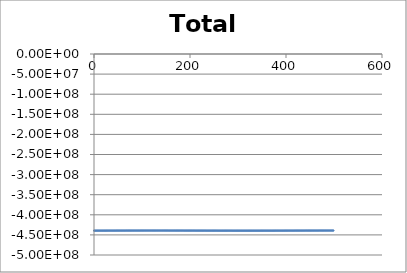
| Category | Total Energy |
|---|---|
| 0.0 | -439333333.333 |
| 1.0 | -439331749.302 |
| 2.0 | -439330144.525 |
| 3.0 | -439328519.493 |
| 4.0 | -439326874.708 |
| 5.0 | -439325210.683 |
| 6.0 | -439323527.935 |
| 7.0 | -439321826.993 |
| 8.0 | -439320108.393 |
| 9.0 | -439318372.68 |
| 10.0 | -439316620.407 |
| 11.0 | -439314852.133 |
| 12.0 | -439313068.427 |
| 13.0 | -439311269.863 |
| 14.0 | -439309457.022 |
| 15.0 | -439307630.495 |
| 16.0 | -439305790.875 |
| 17.0 | -439303938.764 |
| 18.0 | -439302074.769 |
| 19.0 | -439300199.503 |
| 20.0 | -439298313.585 |
| 21.0 | -439296417.637 |
| 22.0 | -439294512.289 |
| 23.0 | -439292598.172 |
| 24.0 | -439290675.924 |
| 25.0 | -439288746.186 |
| 26.0 | -439286809.603 |
| 27.0 | -439284866.822 |
| 28.0 | -439282918.494 |
| 29.0 | -439280965.274 |
| 30.0 | -439279007.816 |
| 31.0 | -439277046.781 |
| 32.0 | -439275082.827 |
| 33.0 | -439273116.616 |
| 34.0 | -439271148.81 |
| 35.0 | -439269180.074 |
| 36.0 | -439267211.07 |
| 37.0 | -439265242.464 |
| 38.0 | -439263274.918 |
| 39.0 | -439261309.097 |
| 40.0 | -439259345.662 |
| 41.0 | -439257385.277 |
| 42.0 | -439255428.6 |
| 43.0 | -439253476.29 |
| 44.0 | -439251529.003 |
| 45.0 | -439249587.394 |
| 46.0 | -439247652.113 |
| 47.0 | -439245723.808 |
| 48.0 | -439243803.125 |
| 49.0 | -439241890.705 |
| 50.0 | -439239987.184 |
| 51.0 | -439238093.197 |
| 52.0 | -439236209.371 |
| 53.0 | -439234336.33 |
| 54.0 | -439232474.693 |
| 55.0 | -439230625.073 |
| 56.0 | -439228788.077 |
| 57.0 | -439226964.307 |
| 58.0 | -439225154.359 |
| 59.0 | -439223358.822 |
| 60.0 | -439221578.277 |
| 61.0 | -439219813.299 |
| 62.0 | -439218064.458 |
| 63.0 | -439216332.312 |
| 64.0 | -439214617.416 |
| 65.0 | -439212920.313 |
| 66.0 | -439211241.541 |
| 67.0 | -439209581.627 |
| 68.0 | -439207941.092 |
| 69.0 | -439206320.447 |
| 70.0 | -439204720.193 |
| 71.0 | -439203140.823 |
| 72.0 | -439201582.821 |
| 73.0 | -439200046.66 |
| 74.0 | -439198532.806 |
| 75.0 | -439197041.712 |
| 76.0 | -439195573.823 |
| 77.0 | -439194129.573 |
| 78.0 | -439192709.386 |
| 79.0 | -439191313.677 |
| 80.0 | -439189942.847 |
| 81.0 | -439188597.291 |
| 82.0 | -439187277.388 |
| 83.0 | -439185983.511 |
| 84.0 | -439184716.02 |
| 85.0 | -439183475.263 |
| 86.0 | -439182261.579 |
| 87.0 | -439181075.294 |
| 88.0 | -439179916.724 |
| 89.0 | -439178786.174 |
| 90.0 | -439177683.937 |
| 91.0 | -439176610.294 |
| 92.0 | -439175565.516 |
| 93.0 | -439174549.862 |
| 94.0 | -439173563.579 |
| 95.0 | -439172606.904 |
| 96.0 | -439171680.062 |
| 97.0 | -439170783.266 |
| 98.0 | -439169916.718 |
| 99.0 | -439169080.609 |
| 100.0 | -439168275.118 |
| 101.0 | -439167500.413 |
| 102.0 | -439166756.65 |
| 103.0 | -439166043.976 |
| 104.0 | -439165362.524 |
| 105.0 | -439164712.417 |
| 106.0 | -439164093.768 |
| 107.0 | -439163506.677 |
| 108.0 | -439162951.234 |
| 109.0 | -439162427.519 |
| 110.0 | -439161935.599 |
| 111.0 | -439161475.533 |
| 112.0 | -439161047.368 |
| 113.0 | -439160651.139 |
| 114.0 | -439160286.873 |
| 115.0 | -439159954.585 |
| 116.0 | -439159654.281 |
| 117.0 | -439159385.957 |
| 118.0 | -439159149.596 |
| 119.0 | -439158945.176 |
| 120.0 | -439158772.66 |
| 121.0 | -439158632.006 |
| 122.0 | -439158523.159 |
| 123.0 | -439158446.057 |
| 124.0 | -439158400.626 |
| 125.0 | -439158386.786 |
| 126.0 | -439158404.446 |
| 127.0 | -439158453.506 |
| 128.0 | -439158533.859 |
| 129.0 | -439158645.387 |
| 130.0 | -439158787.964 |
| 131.0 | -439158961.459 |
| 132.0 | -439159165.727 |
| 133.0 | -439159400.621 |
| 134.0 | -439159665.981 |
| 135.0 | -439159961.642 |
| 136.0 | -439160287.432 |
| 137.0 | -439160643.168 |
| 138.0 | -439161028.664 |
| 139.0 | -439161443.723 |
| 140.0 | -439161888.145 |
| 141.0 | -439162361.719 |
| 142.0 | -439162864.229 |
| 143.0 | -439163395.454 |
| 144.0 | -439163955.164 |
| 145.0 | -439164543.124 |
| 146.0 | -439165159.092 |
| 147.0 | -439165802.821 |
| 148.0 | -439166474.057 |
| 149.0 | -439167172.542 |
| 150.0 | -439167898.011 |
| 151.0 | -439168650.193 |
| 152.0 | -439169428.813 |
| 153.0 | -439170233.59 |
| 154.0 | -439171064.239 |
| 155.0 | -439171920.468 |
| 156.0 | -439172801.983 |
| 157.0 | -439173708.482 |
| 158.0 | -439174639.662 |
| 159.0 | -439175595.213 |
| 160.0 | -439176574.822 |
| 161.0 | -439177578.172 |
| 162.0 | -439178604.94 |
| 163.0 | -439179654.801 |
| 164.0 | -439180727.427 |
| 165.0 | -439181822.483 |
| 166.0 | -439182939.635 |
| 167.0 | -439184078.54 |
| 168.0 | -439185238.857 |
| 169.0 | -439186420.239 |
| 170.0 | -439187622.335 |
| 171.0 | -439188844.794 |
| 172.0 | -439190087.26 |
| 173.0 | -439191349.374 |
| 174.0 | -439192630.775 |
| 175.0 | -439193931.1 |
| 176.0 | -439195249.982 |
| 177.0 | -439196587.052 |
| 178.0 | -439197941.939 |
| 179.0 | -439199314.27 |
| 180.0 | -439200703.67 |
| 181.0 | -439202109.76 |
| 182.0 | -439203532.162 |
| 183.0 | -439204970.493 |
| 184.0 | -439206424.37 |
| 185.0 | -439207893.408 |
| 186.0 | -439209377.221 |
| 187.0 | -439210875.419 |
| 188.0 | -439212387.612 |
| 189.0 | -439213913.409 |
| 190.0 | -439215452.418 |
| 191.0 | -439217004.242 |
| 192.0 | -439218568.488 |
| 193.0 | -439220144.758 |
| 194.0 | -439221732.654 |
| 195.0 | -439223331.776 |
| 196.0 | -439224941.725 |
| 197.0 | -439226562.099 |
| 198.0 | -439228192.495 |
| 199.0 | -439229832.512 |
| 200.0 | -439231481.744 |
| 201.0 | -439233139.788 |
| 202.0 | -439234806.237 |
| 203.0 | -439236480.685 |
| 204.0 | -439238162.725 |
| 205.0 | -439239851.949 |
| 206.0 | -439241547.95 |
| 207.0 | -439243250.319 |
| 208.0 | -439244958.646 |
| 209.0 | -439246672.522 |
| 210.0 | -439248391.537 |
| 211.0 | -439250115.28 |
| 212.0 | -439251843.341 |
| 213.0 | -439253575.308 |
| 214.0 | -439255310.769 |
| 215.0 | -439257049.314 |
| 216.0 | -439258790.53 |
| 217.0 | -439260534.006 |
| 218.0 | -439262279.329 |
| 219.0 | -439264026.086 |
| 220.0 | -439265773.866 |
| 221.0 | -439267522.256 |
| 222.0 | -439269270.844 |
| 223.0 | -439271019.217 |
| 224.0 | -439272766.963 |
| 225.0 | -439274513.67 |
| 226.0 | -439276258.925 |
| 227.0 | -439278002.317 |
| 228.0 | -439279743.433 |
| 229.0 | -439281481.863 |
| 230.0 | -439283217.195 |
| 231.0 | -439284949.018 |
| 232.0 | -439286676.921 |
| 233.0 | -439288400.493 |
| 234.0 | -439290119.326 |
| 235.0 | -439291833.009 |
| 236.0 | -439293541.133 |
| 237.0 | -439295243.289 |
| 238.0 | -439296939.07 |
| 239.0 | -439298628.068 |
| 240.0 | -439300309.876 |
| 241.0 | -439301984.087 |
| 242.0 | -439303650.298 |
| 243.0 | -439305308.101 |
| 244.0 | -439306957.094 |
| 245.0 | -439308596.873 |
| 246.0 | -439310227.036 |
| 247.0 | -439311847.181 |
| 248.0 | -439313456.909 |
| 249.0 | -439315055.818 |
| 250.0 | -439316643.512 |
| 251.0 | -439318219.593 |
| 252.0 | -439319783.664 |
| 253.0 | -439321335.331 |
| 254.0 | -439322874.201 |
| 255.0 | -439324399.88 |
| 256.0 | -439325911.978 |
| 257.0 | -439327410.106 |
| 258.0 | -439328893.875 |
| 259.0 | -439330362.9 |
| 260.0 | -439331816.796 |
| 261.0 | -439333255.18 |
| 262.0 | -439334677.671 |
| 263.0 | -439336083.89 |
| 264.0 | -439337473.459 |
| 265.0 | -439338846.003 |
| 266.0 | -439340201.149 |
| 267.0 | -439341538.526 |
| 268.0 | -439342857.765 |
| 269.0 | -439344158.501 |
| 270.0 | -439345440.369 |
| 271.0 | -439346703.007 |
| 272.0 | -439347946.058 |
| 273.0 | -439349169.164 |
| 274.0 | -439350371.974 |
| 275.0 | -439351554.136 |
| 276.0 | -439352715.303 |
| 277.0 | -439353855.13 |
| 278.0 | -439354973.278 |
| 279.0 | -439356069.409 |
| 280.0 | -439357143.187 |
| 281.0 | -439358194.282 |
| 282.0 | -439359222.368 |
| 283.0 | -439360227.12 |
| 284.0 | -439361208.22 |
| 285.0 | -439362165.351 |
| 286.0 | -439363098.203 |
| 287.0 | -439364006.469 |
| 288.0 | -439364889.844 |
| 289.0 | -439365748.032 |
| 290.0 | -439366580.739 |
| 291.0 | -439367387.675 |
| 292.0 | -439368168.556 |
| 293.0 | -439368923.103 |
| 294.0 | -439369651.043 |
| 295.0 | -439370352.105 |
| 296.0 | -439371026.028 |
| 297.0 | -439371672.552 |
| 298.0 | -439372291.426 |
| 299.0 | -439372882.403 |
| 300.0 | -439373445.244 |
| 301.0 | -439373979.712 |
| 302.0 | -439374485.581 |
| 303.0 | -439374962.628 |
| 304.0 | -439375410.638 |
| 305.0 | -439375829.402 |
| 306.0 | -439376218.719 |
| 307.0 | -439376578.393 |
| 308.0 | -439376908.236 |
| 309.0 | -439377208.068 |
| 310.0 | -439377477.716 |
| 311.0 | -439377717.013 |
| 312.0 | -439377925.802 |
| 313.0 | -439378103.931 |
| 314.0 | -439378251.26 |
| 315.0 | -439378367.652 |
| 316.0 | -439378452.983 |
| 317.0 | -439378507.134 |
| 318.0 | -439378529.995 |
| 319.0 | -439378521.467 |
| 320.0 | -439378481.458 |
| 321.0 | -439378409.883 |
| 322.0 | -439378306.67 |
| 323.0 | -439378171.754 |
| 324.0 | -439378005.078 |
| 325.0 | -439377806.597 |
| 326.0 | -439377576.274 |
| 327.0 | -439377314.083 |
| 328.0 | -439377020.005 |
| 329.0 | -439376694.035 |
| 330.0 | -439376336.174 |
| 331.0 | -439375946.435 |
| 332.0 | -439375524.842 |
| 333.0 | -439375071.428 |
| 334.0 | -439374586.237 |
| 335.0 | -439374069.322 |
| 336.0 | -439373520.75 |
| 337.0 | -439372940.595 |
| 338.0 | -439372328.944 |
| 339.0 | -439371685.894 |
| 340.0 | -439371011.553 |
| 341.0 | -439370306.041 |
| 342.0 | -439369569.487 |
| 343.0 | -439368802.033 |
| 344.0 | -439368003.831 |
| 345.0 | -439367175.045 |
| 346.0 | -439366315.85 |
| 347.0 | -439365426.431 |
| 348.0 | -439364506.986 |
| 349.0 | -439363557.724 |
| 350.0 | -439362578.865 |
| 351.0 | -439361570.64 |
| 352.0 | -439360533.292 |
| 353.0 | -439359467.076 |
| 354.0 | -439358372.255 |
| 355.0 | -439357249.108 |
| 356.0 | -439356097.922 |
| 357.0 | -439354918.996 |
| 358.0 | -439353712.641 |
| 359.0 | -439352479.179 |
| 360.0 | -439351218.941 |
| 361.0 | -439349932.273 |
| 362.0 | -439348619.528 |
| 363.0 | -439347281.073 |
| 364.0 | -439345917.283 |
| 365.0 | -439344528.547 |
| 366.0 | -439343115.261 |
| 367.0 | -439341677.835 |
| 368.0 | -439340216.687 |
| 369.0 | -439338732.247 |
| 370.0 | -439337224.952 |
| 371.0 | -439335695.254 |
| 372.0 | -439334143.61 |
| 373.0 | -439332570.49 |
| 374.0 | -439330976.373 |
| 375.0 | -439329361.746 |
| 376.0 | -439327727.105 |
| 377.0 | -439326072.958 |
| 378.0 | -439324399.82 |
| 379.0 | -439322708.213 |
| 380.0 | -439320998.671 |
| 381.0 | -439319271.733 |
| 382.0 | -439317527.948 |
| 383.0 | -439315767.873 |
| 384.0 | -439313992.07 |
| 385.0 | -439312201.112 |
| 386.0 | -439310395.576 |
| 387.0 | -439308576.047 |
| 388.0 | -439306743.118 |
| 389.0 | -439304897.386 |
| 390.0 | -439303039.457 |
| 391.0 | -439301169.938 |
| 392.0 | -439299289.447 |
| 393.0 | -439297398.604 |
| 394.0 | -439295498.035 |
| 395.0 | -439293588.37 |
| 396.0 | -439291670.244 |
| 397.0 | -439289744.297 |
| 398.0 | -439287811.17 |
| 399.0 | -439285871.511 |
| 400.0 | -439283925.968 |
| 401.0 | -439281975.194 |
| 402.0 | -439280019.844 |
| 403.0 | -439278060.575 |
| 404.0 | -439276098.047 |
| 405.0 | -439274132.92 |
| 406.0 | -439272165.855 |
| 407.0 | -439270197.517 |
| 408.0 | -439268228.569 |
| 409.0 | -439266259.674 |
| 410.0 | -439264291.497 |
| 411.0 | -439262324.702 |
| 412.0 | -439260359.952 |
| 413.0 | -439258397.908 |
| 414.0 | -439256439.232 |
| 415.0 | -439254484.584 |
| 416.0 | -439252534.619 |
| 417.0 | -439250589.995 |
| 418.0 | -439248651.362 |
| 419.0 | -439246719.372 |
| 420.0 | -439244794.67 |
| 421.0 | -439242877.9 |
| 422.0 | -439240969.701 |
| 423.0 | -439239070.708 |
| 424.0 | -439237181.553 |
| 425.0 | -439235302.861 |
| 426.0 | -439233435.254 |
| 427.0 | -439231579.348 |
| 428.0 | -439229735.753 |
| 429.0 | -439227905.074 |
| 430.0 | -439226087.909 |
| 431.0 | -439224284.852 |
| 432.0 | -439222496.487 |
| 433.0 | -439220723.393 |
| 434.0 | -439218966.143 |
| 435.0 | -439217225.3 |
| 436.0 | -439215501.421 |
| 437.0 | -439213795.056 |
| 438.0 | -439212106.745 |
| 439.0 | -439210437.02 |
| 440.0 | -439208786.407 |
| 441.0 | -439207155.42 |
| 442.0 | -439205544.566 |
| 443.0 | -439203954.343 |
| 444.0 | -439202385.239 |
| 445.0 | -439200837.733 |
| 446.0 | -439199312.295 |
| 447.0 | -439197809.383 |
| 448.0 | -439196329.448 |
| 449.0 | -439194872.928 |
| 450.0 | -439193440.255 |
| 451.0 | -439192031.845 |
| 452.0 | -439190648.109 |
| 453.0 | -439189289.444 |
| 454.0 | -439187956.237 |
| 455.0 | -439186648.866 |
| 456.0 | -439185367.695 |
| 457.0 | -439184113.08 |
| 458.0 | -439182885.364 |
| 459.0 | -439181684.88 |
| 460.0 | -439180511.95 |
| 461.0 | -439179366.883 |
| 462.0 | -439178249.979 |
| 463.0 | -439177161.525 |
| 464.0 | -439176101.797 |
| 465.0 | -439175071.061 |
| 466.0 | -439174069.57 |
| 467.0 | -439173097.567 |
| 468.0 | -439172155.281 |
| 469.0 | -439171242.932 |
| 470.0 | -439170360.729 |
| 471.0 | -439169508.867 |
| 472.0 | -439168687.532 |
| 473.0 | -439167896.897 |
| 474.0 | -439167137.126 |
| 475.0 | -439166408.369 |
| 476.0 | -439165710.766 |
| 477.0 | -439165044.446 |
| 478.0 | -439164409.528 |
| 479.0 | -439163806.117 |
| 480.0 | -439163234.309 |
| 481.0 | -439162694.189 |
| 482.0 | -439162185.831 |
| 483.0 | -439161709.298 |
| 484.0 | -439161264.642 |
| 485.0 | -439160851.905 |
| 486.0 | -439160471.12 |
| 487.0 | -439160122.305 |
| 488.0 | -439159805.474 |
| 489.0 | -439159520.625 |
| 490.0 | -439159267.749 |
| 491.0 | -439159046.826 |
| 492.0 | -439158857.829 |
| 493.0 | -439158700.716 |
| 494.0 | -439158575.439 |
| 495.0 | -439158481.941 |
| 496.0 | -439158420.153 |
| 497.0 | -439158389.999 |
| 498.0 | -439158391.393 |
| 499.0 | -439158424.24 |